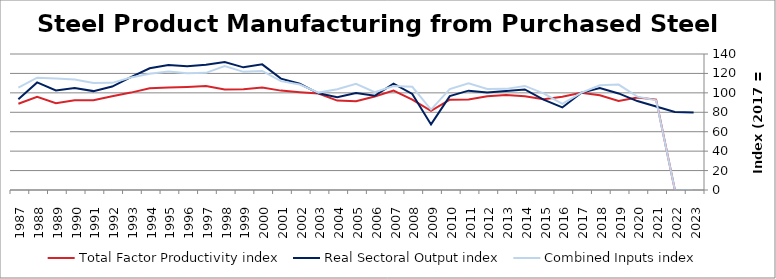
| Category | Total Factor Productivity index | Real Sectoral Output index | Combined Inputs index |
|---|---|---|---|
| 2023.0 | 0 | 79.898 | 0 |
| 2022.0 | 0 | 80.245 | 0 |
| 2021.0 | 93.044 | 85.962 | 92.389 |
| 2020.0 | 95.253 | 91.539 | 96.1 |
| 2019.0 | 91.637 | 99.407 | 108.479 |
| 2018.0 | 97.483 | 105.039 | 107.751 |
| 2017.0 | 100 | 100 | 100 |
| 2016.0 | 95.919 | 84.969 | 88.584 |
| 2015.0 | 93.373 | 92.966 | 99.564 |
| 2014.0 | 96.572 | 103.477 | 107.15 |
| 2013.0 | 97.911 | 101.931 | 104.105 |
| 2012.0 | 96.445 | 100.303 | 104 |
| 2011.0 | 93.101 | 102.263 | 109.841 |
| 2010.0 | 93.025 | 96.629 | 103.875 |
| 2009.0 | 81.52 | 67.511 | 82.815 |
| 2008.0 | 93.12 | 98.899 | 106.206 |
| 2007.0 | 102.264 | 109.554 | 107.128 |
| 2006.0 | 96.327 | 96.999 | 100.698 |
| 2005.0 | 91.416 | 99.852 | 109.228 |
| 2004.0 | 92.043 | 95.386 | 103.631 |
| 2003.0 | 99.241 | 99.503 | 100.264 |
| 2002.0 | 100.683 | 109.351 | 108.609 |
| 2001.0 | 102.302 | 114.664 | 112.084 |
| 2000.0 | 105.535 | 129.309 | 122.528 |
| 1999.0 | 103.819 | 126.258 | 121.614 |
| 1998.0 | 103.371 | 131.84 | 127.54 |
| 1997.0 | 107.012 | 129.047 | 120.592 |
| 1996.0 | 106.094 | 127.42 | 120.101 |
| 1995.0 | 105.563 | 128.645 | 121.866 |
| 1994.0 | 104.673 | 125.259 | 119.667 |
| 1993.0 | 100.264 | 116.105 | 115.799 |
| 1992.0 | 96.553 | 106.493 | 110.295 |
| 1991.0 | 92.473 | 101.8 | 110.086 |
| 1990.0 | 92.357 | 105.018 | 113.709 |
| 1989.0 | 89.286 | 102.472 | 114.768 |
| 1988.0 | 95.839 | 110.775 | 115.585 |
| 1987.0 | 88.728 | 93.464 | 105.338 |